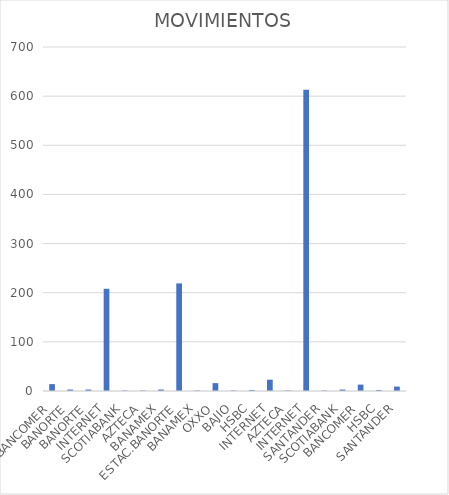
| Category | MOVIMIENTOS |
|---|---|
| BANCOMER | 14 |
| BANORTE | 3 |
| BANORTE | 3 |
| INTERNET | 208 |
| SCOTIABANK | 1 |
| AZTECA | 1 |
| BANAMEX | 3 |
| ESTAC.BANORTE | 219 |
| BANAMEX | 1 |
| OXXO | 16 |
| BAJIO | 1 |
| HSBC | 2 |
| INTERNET | 23 |
| AZTECA | 1 |
| INTERNET | 613 |
| SANTANDER | 1 |
| SCOTIABANK | 3 |
| BANCOMER | 13 |
| HSBC | 2 |
| SANTANDER | 9 |